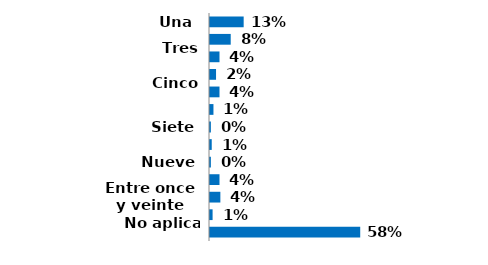
| Category | Series 0 |
|---|---|
| Una  | 0.13 |
| Dos | 0.08 |
| Tres | 0.037 |
| Cuatro | 0.023 |
| Cinco | 0.037 |
| Seis | 0.013 |
| Siete  | 0.003 |
| Ocho  | 0.007 |
| Nueve  | 0.003 |
| Diez | 0.037 |
| Entre once y veinte | 0.04 |
| Más de veinte | 0.01 |
| No aplica | 0.58 |